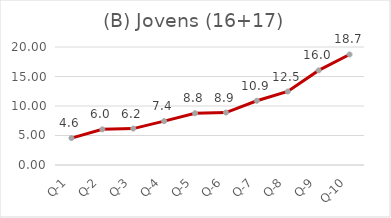
| Category | PERT(16+17) |
|---|---|
| Q-1 | 4.564 |
| Q-2 | 6.044 |
| Q-3 | 6.172 |
| Q-4 | 7.435 |
| Q-5 | 8.777 |
| Q-6 | 8.894 |
| Q-7 | 10.889 |
| Q-8 | 12.458 |
| Q-9 | 16.035 |
| Q-10 | 18.733 |